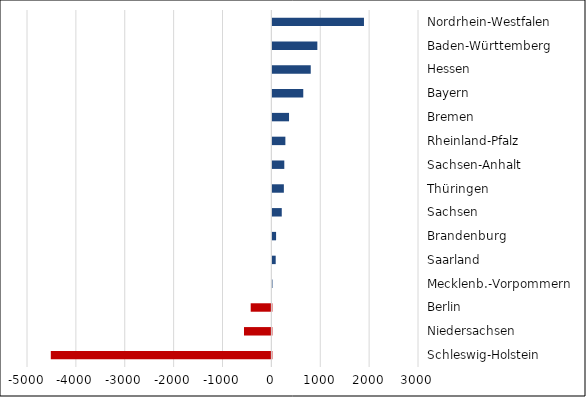
| Category | Series 0 |
|---|---|
| Schleswig-Holstein | -4513 |
| Niedersachsen | -560 |
| Berlin | -423 |
| Mecklenb.-Vorpommern | 2 |
| Saarland | 68 |
| Brandenburg | 76 |
| Sachsen | 192 |
| Thüringen | 235 |
| Sachsen-Anhalt | 244 |
| Rheinland-Pfalz | 266 |
| Bremen | 341 |
| Bayern | 632 |
| Hessen | 785 |
| Baden-Württemberg | 920 |
| Nordrhein-Westfalen | 1874 |